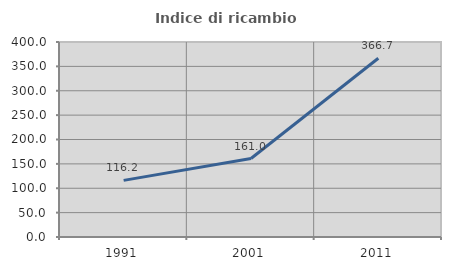
| Category | Indice di ricambio occupazionale  |
|---|---|
| 1991.0 | 116.176 |
| 2001.0 | 160.976 |
| 2011.0 | 366.667 |